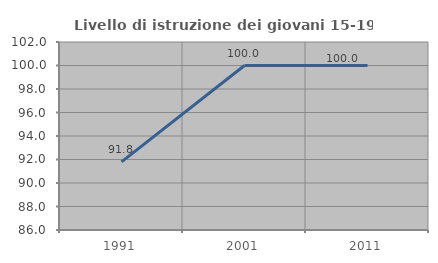
| Category | Livello di istruzione dei giovani 15-19 anni |
|---|---|
| 1991.0 | 91.803 |
| 2001.0 | 100 |
| 2011.0 | 100 |